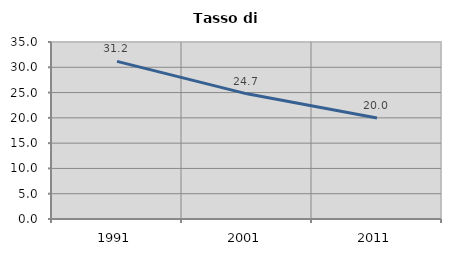
| Category | Tasso di disoccupazione   |
|---|---|
| 1991.0 | 31.165 |
| 2001.0 | 24.748 |
| 2011.0 | 19.983 |